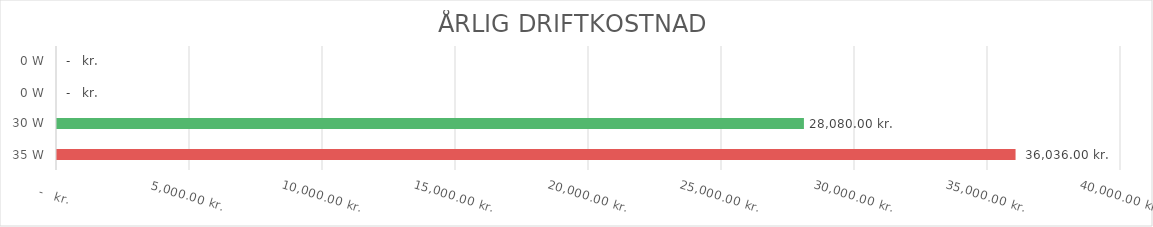
| Category | ÅRLIG ENERGIKOSTNAD KR./KWH  |
|---|---|
| 35.0 | 36036 |
| 30.0 | 28080 |
| 0.0 | 0 |
| 0.0 | 0 |